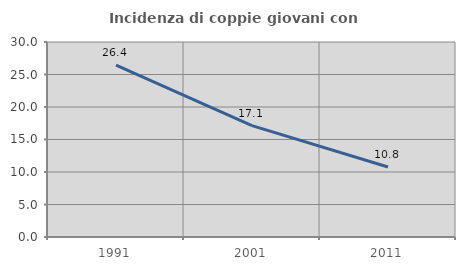
| Category | Incidenza di coppie giovani con figli |
|---|---|
| 1991.0 | 26.44 |
| 2001.0 | 17.143 |
| 2011.0 | 10.773 |